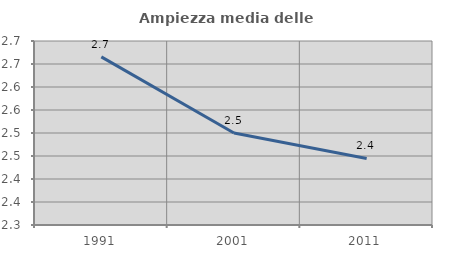
| Category | Ampiezza media delle famiglie |
|---|---|
| 1991.0 | 2.666 |
| 2001.0 | 2.5 |
| 2011.0 | 2.445 |